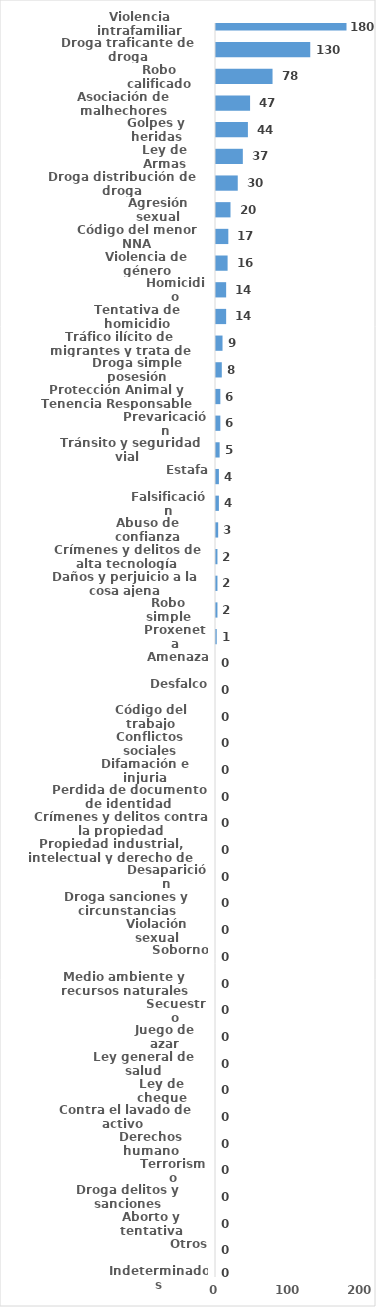
| Category | Series 0 |
|---|---|
| Violencia intrafamiliar | 180 |
| Droga traficante de droga | 130 |
| Robo calificado | 78 |
| Asociación de malhechores | 47 |
| Golpes y heridas | 44 |
| Ley de Armas | 37 |
| Droga distribución de droga | 30 |
| Agresión sexual | 20 |
| Código del menor NNA | 17 |
| Violencia de género | 16 |
| Homicidio | 14 |
| Tentativa de homicidio | 14 |
| Tráfico ilícito de migrantes y trata de personas | 9 |
| Droga simple posesión | 8 |
| Protección Animal y Tenencia Responsable | 6 |
| Prevaricación | 6 |
| Tránsito y seguridad vial  | 5 |
| Estafa | 4 |
| Falsificación | 4 |
| Abuso de confianza | 3 |
| Crímenes y delitos de alta tecnología | 2 |
| Daños y perjuicio a la cosa ajena | 2 |
| Robo simple | 2 |
| Proxeneta | 1 |
| Amenaza | 0 |
| Desfalco | 0 |
| Código del trabajo | 0 |
| Conflictos sociales | 0 |
| Difamación e injuria | 0 |
| Perdida de documento de identidad | 0 |
| Crímenes y delitos contra la propiedad | 0 |
| Propiedad industrial, intelectual y derecho de autor | 0 |
| Desaparición | 0 |
| Droga sanciones y circunstancias agravantes | 0 |
| Violación sexual | 0 |
| Soborno | 0 |
| Medio ambiente y recursos naturales | 0 |
| Secuestro | 0 |
| Juego de azar | 0 |
| Ley general de salud | 0 |
| Ley de cheque | 0 |
| Contra el lavado de activo  | 0 |
| Derechos humano | 0 |
| Terrorismo | 0 |
| Droga delitos y sanciones | 0 |
| Aborto y tentativa | 0 |
| Otros | 0 |
| Indeterminados | 0 |